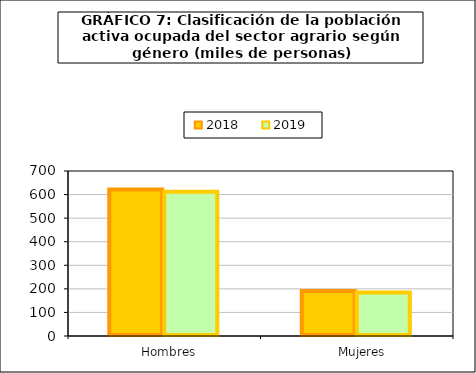
| Category | 2018 | 2019 |
|---|---|---|
|    Hombres | 621.4 | 612.3 |
|    Mujeres | 191.125 | 185 |